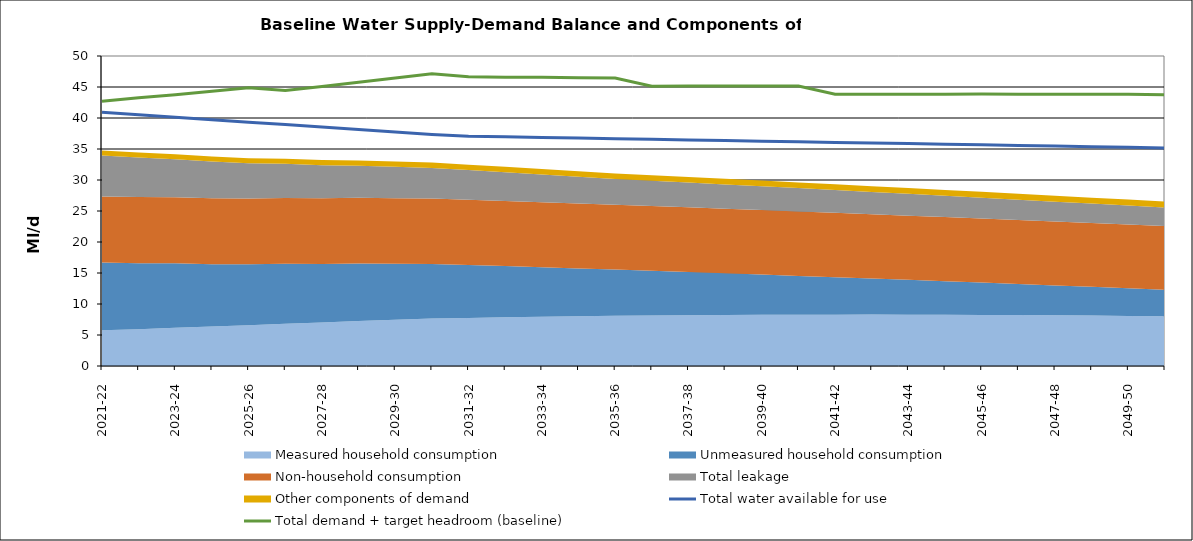
| Category | Total water available for use | Total demand + target headroom (baseline) |
|---|---|---|
| 2020-21 | 40.916 | 42.685 |
| 2021-22 | 40.521 | 43.27 |
| 2022-23 | 40.125 | 43.765 |
| 2023-24 | 39.729 | 44.302 |
| 2024-25 | 39.333 | 44.879 |
| 2025-26 | 38.937 | 44.453 |
| 2026-27 | 38.541 | 45.062 |
| 2027-28 | 38.146 | 45.768 |
| 2028-29 | 37.75 | 46.469 |
| 2029-30 | 37.354 | 47.116 |
| 2030-31 | 37.057 | 46.667 |
| 2031-32 | 36.958 | 46.58 |
| 2032-33 | 36.859 | 46.559 |
| 2033-34 | 36.76 | 46.493 |
| 2034-35 | 36.661 | 46.463 |
| 2035-36 | 36.562 | 45.121 |
| 2036-37 | 36.463 | 45.155 |
| 2037-38 | 36.364 | 45.165 |
| 2038-39 | 36.265 | 45.163 |
| 2039-40 | 36.166 | 45.158 |
| 2040-41 | 36.068 | 43.83 |
| 2041-42 | 35.969 | 43.82 |
| 2042-43 | 35.87 | 43.827 |
| 2043-44 | 35.771 | 43.812 |
| 2044-45 | 35.672 | 43.854 |
| 2045-46 | 35.573 | 43.824 |
| 2046-47 | 35.474 | 43.812 |
| 2047-48 | 35.375 | 43.827 |
| 2048-49 | 35.276 | 43.811 |
| 2049-50 | 35.177 | 43.763 |